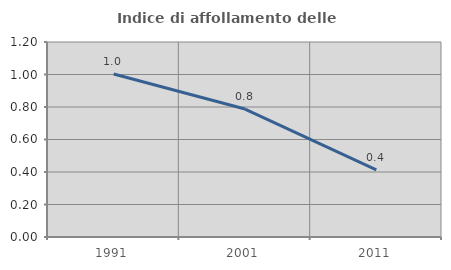
| Category | Indice di affollamento delle abitazioni  |
|---|---|
| 1991.0 | 1.003 |
| 2001.0 | 0.787 |
| 2011.0 | 0.413 |